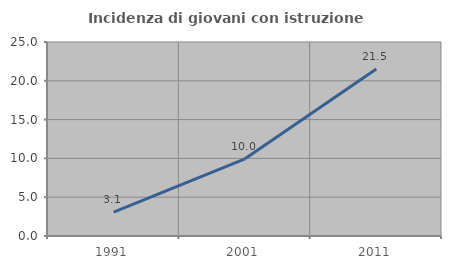
| Category | Incidenza di giovani con istruzione universitaria |
|---|---|
| 1991.0 | 3.065 |
| 2001.0 | 9.953 |
| 2011.0 | 21.533 |